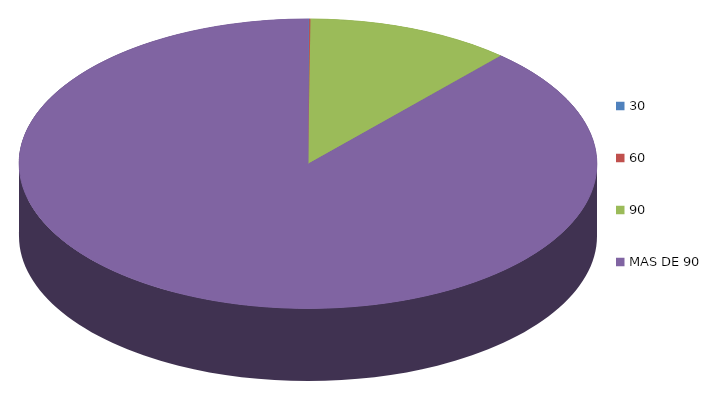
| Category | Series 0 | 34,413.8 |
|---|---|---|
| 0 | 34413.8 |  |
| 1 | 34859.7 |  |
| 2 | 5838884.6 |  |
| 3 | 44992550.8 |  |